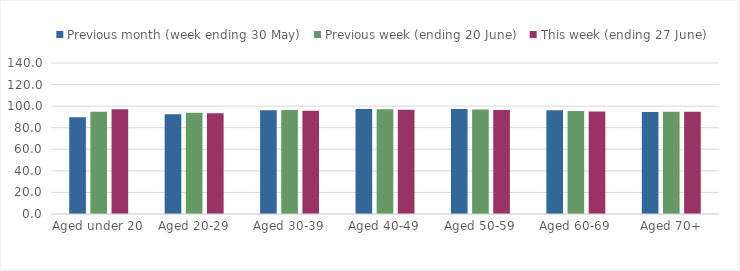
| Category | Previous month (week ending 30 May) | Previous week (ending 20 June) | This week (ending 27 June) |
|---|---|---|---|
| Aged under 20 | 89.601 | 94.785 | 97.031 |
| Aged 20-29 | 92.548 | 93.769 | 93.503 |
| Aged 30-39 | 96.272 | 96.349 | 95.618 |
| Aged 40-49 | 97.318 | 97.082 | 96.638 |
| Aged 50-59 | 97.443 | 97.001 | 96.535 |
| Aged 60-69 | 96.246 | 95.513 | 95.044 |
| Aged 70+ | 94.664 | 94.872 | 94.89 |